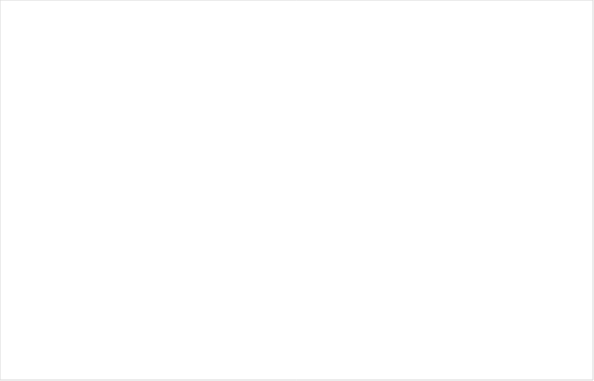
| Category | Ingen brist | Föreläggande | Föreläggande vid vite | Anmärkning |
|---|---|---|---|---|
| Enskild en enhet | 0.788 | 0.154 | 0.058 | 0 |
| Enskild flera enhet | 0.905 | 0.081 | 0.014 | 0 |
| Offentlig | 0.944 | 0.049 | 0.005 | 0.002 |